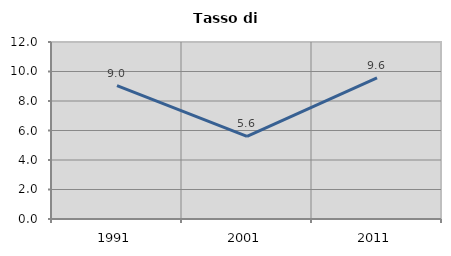
| Category | Tasso di disoccupazione   |
|---|---|
| 1991.0 | 9.047 |
| 2001.0 | 5.603 |
| 2011.0 | 9.576 |